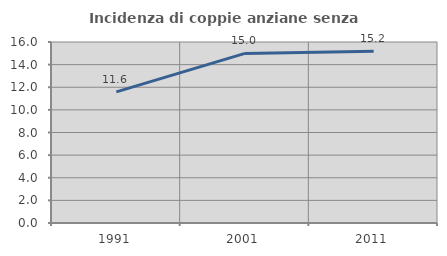
| Category | Incidenza di coppie anziane senza figli  |
|---|---|
| 1991.0 | 11.593 |
| 2001.0 | 14.99 |
| 2011.0 | 15.188 |